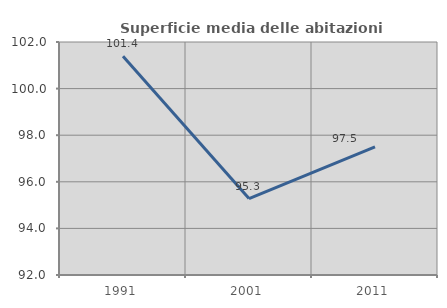
| Category | Superficie media delle abitazioni occupate |
|---|---|
| 1991.0 | 101.388 |
| 2001.0 | 95.281 |
| 2011.0 | 97.496 |